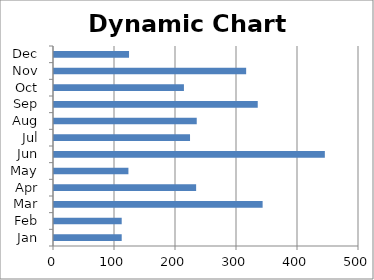
| Category | Series 0 |
|---|---|
| Jan | 111 |
| Feb | 111 |
| Mar | 342 |
| Apr | 233 |
| May | 122 |
| Jun | 444 |
| Jul | 223 |
| Aug | 234 |
| Sep | 334 |
| Oct | 213 |
| Nov | 315 |
| Dec | 123 |